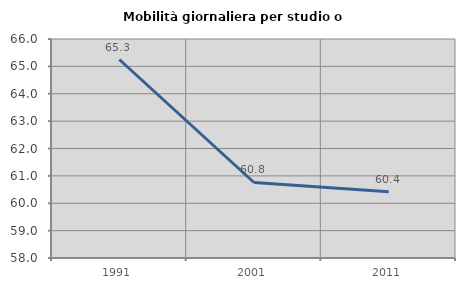
| Category | Mobilità giornaliera per studio o lavoro |
|---|---|
| 1991.0 | 65.251 |
| 2001.0 | 60.759 |
| 2011.0 | 60.424 |